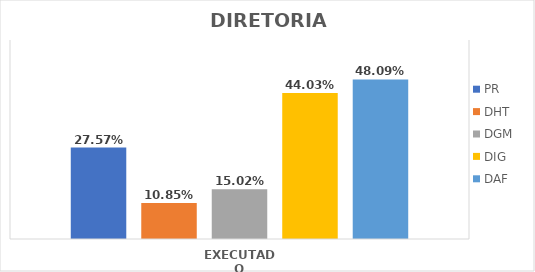
| Category | PR | DHT | DGM | DIG | DAF |
|---|---|---|---|---|---|
| EXECUTADO | 0.276 | 0.108 | 0.15 | 0.44 | 0.481 |